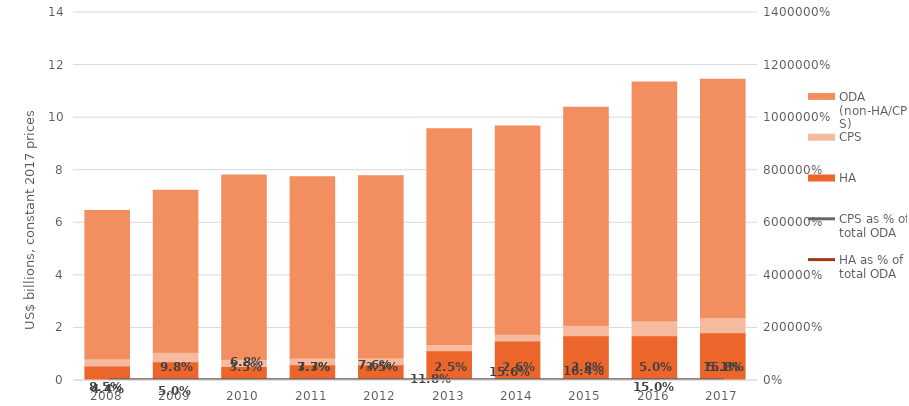
| Category | HA | CPS | ODA (non-HA/CPS) |
|---|---|---|---|
| 2008.0 | 547.365 | 283.612 | 5632.315 |
| 2009.0 | 710.43 | 363.229 | 6165.939 |
| 2010.0 | 533.299 | 271.828 | 7017.185 |
| 2011.0 | 600.15 | 256.184 | 6898.962 |
| 2012.0 | 594.746 | 271.131 | 6923.224 |
| 2013.0 | 1131.047 | 242.782 | 8203.933 |
| 2014.0 | 1506.898 | 254.033 | 7920.178 |
| 2015.0 | 1705.005 | 399.104 | 8294.716 |
| 2016.0 | 1707.125 | 565.539 | 9086.973 |
| 2017.0 | 1812.797 | 585.455 | 9062.996 |